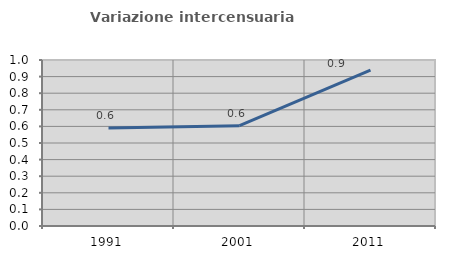
| Category | Variazione intercensuaria annua |
|---|---|
| 1991.0 | 0.59 |
| 2001.0 | 0.604 |
| 2011.0 | 0.939 |